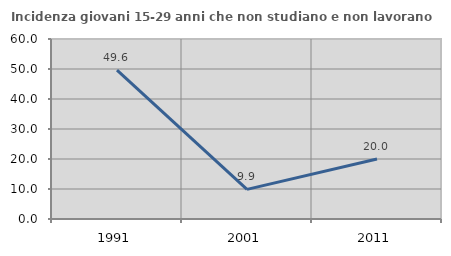
| Category | Incidenza giovani 15-29 anni che non studiano e non lavorano  |
|---|---|
| 1991.0 | 49.626 |
| 2001.0 | 9.877 |
| 2011.0 | 20 |